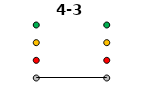
| Category | 0 | 1 | 2 | 3 | 4-3 |
|---|---|---|---|---|---|
| Time 1 | 0 | 1 | 2 | 3 | 0 |
| Time 2 | 0 | 1 | 2 | 3 | 0 |